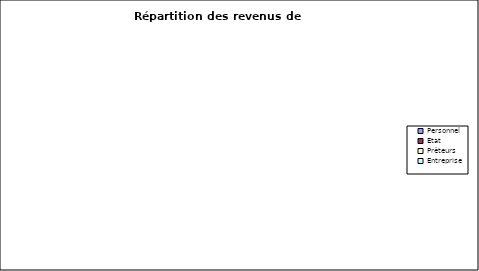
| Category | Series 0 | Series 1 |
|---|---|---|
| Personnel | 0 | 0 |
| Etat | 0 | 0 |
| Prêteurs | 0 | 0 |
| Entreprise | 0 | 0 |